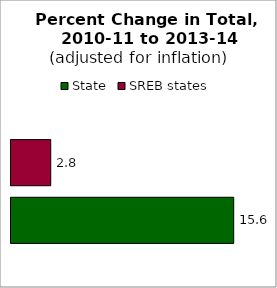
| Category | State | SREB states |
|---|---|---|
| 0 | 15.598 | 2.782 |